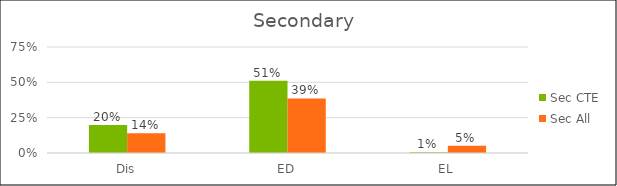
| Category | Sec CTE | Sec All |
|---|---|---|
| Dis | 0.198 | 0.14 |
| ED | 0.512 | 0.386 |
| EL | 0.005 | 0.052 |